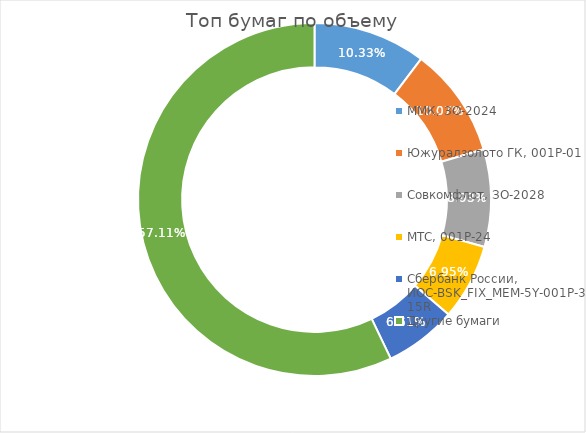
| Category | Топ бумаг по объему |
|---|---|
| 0 | 0.103 |
| 1 | 0.101 |
| 2 | 0.089 |
| 3 | 0.069 |
| 4 | 0.066 |
| 5 | 0.571 |